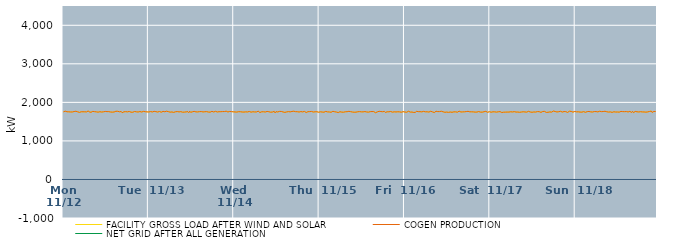
| Category | FACILITY GROSS LOAD AFTER WIND AND SOLAR | COGEN PRODUCTION | NET GRID AFTER ALL GENERATION |
|---|---|---|---|
|  Mon  11/12 | 1754 | 1754 |  |
|  Mon  11/12 | 1760 | 1760 |  |
|  Mon  11/12 | 1771 | 1771 |  |
|  Mon  11/12 | 1764 | 1764 |  |
|  Mon  11/12 | 1756 | 1756 |  |
|  Mon  11/12 | 1752 | 1752 |  |
|  Mon  11/12 | 1755 | 1755 |  |
|  Mon  11/12 | 1756 | 1756 |  |
|  Mon  11/12 | 1751 | 1751 |  |
|  Mon  11/12 | 1760 | 1760 |  |
|  Mon  11/12 | 1751 | 1751 |  |
|  Mon  11/12 | 1750 | 1750 |  |
|  Mon  11/12 | 1762 | 1762 |  |
|  Mon  11/12 | 1755 | 1755 |  |
|  Mon  11/12 | 1769 | 1769 |  |
|  Mon  11/12 | 1765 | 1765 |  |
|  Mon  11/12 | 1755 | 1755 |  |
|  Mon  11/12 | 1764 | 1764 |  |
|  Mon  11/12 | 1740 | 1740 |  |
|  Mon  11/12 | 1749 | 1749 |  |
|  Mon  11/12 | 1756 | 1756 |  |
|  Mon  11/12 | 1748 | 1748 |  |
|  Mon  11/12 | 1756 | 1756 |  |
|  Mon  11/12 | 1747 | 1747 |  |
|  Mon  11/12 | 1755 | 1755 |  |
|  Mon  11/12 | 1747 | 1747 |  |
|  Mon  11/12 | 1753 | 1753 |  |
|  Mon  11/12 | 1756 | 1756 |  |
|  Mon  11/12 | 1778 | 1778 |  |
|  Mon  11/12 | 1751 | 1751 |  |
|  Mon  11/12 | 1773 | 1773 |  |
|  Mon  11/12 | 1743 | 1743 |  |
|  Mon  11/12 | 1768 | 1768 |  |
|  Mon  11/12 | 1766 | 1766 |  |
|  Mon  11/12 | 1769 | 1769 |  |
|  Mon  11/12 | 1759 | 1759 |  |
|  Mon  11/12 | 1764 | 1764 |  |
|  Mon  11/12 | 1754 | 1754 |  |
|  Mon  11/12 | 1755 | 1755 |  |
|  Mon  11/12 | 1746 | 1746 |  |
|  Mon  11/12 | 1747 | 1747 |  |
|  Mon  11/12 | 1757 | 1757 |  |
|  Mon  11/12 | 1767 | 1767 |  |
|  Mon  11/12 | 1749 | 1749 |  |
|  Mon  11/12 | 1744 | 1744 |  |
|  Mon  11/12 | 1755 | 1755 |  |
|  Mon  11/12 | 1740 | 1740 |  |
|  Mon  11/12 | 1764 | 1764 |  |
|  Mon  11/12 | 1752 | 1752 |  |
|  Mon  11/12 | 1760 | 1760 |  |
|  Mon  11/12 | 1745 | 1745 |  |
|  Mon  11/12 | 1760 | 1760 |  |
|  Mon  11/12 | 1757 | 1757 |  |
|  Mon  11/12 | 1750 | 1750 |  |
|  Mon  11/12 | 1759 | 1759 |  |
|  Mon  11/12 | 1746 | 1746 |  |
|  Mon  11/12 | 1747 | 1747 |  |
|  Mon  11/12 | 1751 | 1751 |  |
|  Mon  11/12 | 1761 | 1761 |  |
|  Mon  11/12 | 1769 | 1769 |  |
|  Mon  11/12 | 1752 | 1752 |  |
|  Mon  11/12 | 1768 | 1768 |  |
|  Mon  11/12 | 1764 | 1764 |  |
|  Mon  11/12 | 1756 | 1756 |  |
|  Mon  11/12 | 1736 | 1736 |  |
|  Mon  11/12 | 1763 | 1763 |  |
|  Mon  11/12 | 1731 | 1731 |  |
|  Mon  11/12 | 1746 | 1746 |  |
|  Mon  11/12 | 1755 | 1755 |  |
|  Mon  11/12 | 1748 | 1748 |  |
|  Mon  11/12 | 1759 | 1759 |  |
|  Mon  11/12 | 1752 | 1752 |  |
|  Mon  11/12 | 1754 | 1754 |  |
|  Mon  11/12 | 1738 | 1738 |  |
|  Mon  11/12 | 1763 | 1763 |  |
|  Mon  11/12 | 1760 | 1760 |  |
|  Mon  11/12 | 1745 | 1745 |  |
|  Mon  11/12 | 1762 | 1762 |  |
|  Mon  11/12 | 1744 | 1744 |  |
|  Mon  11/12 | 1759 | 1759 |  |
|  Mon  11/12 | 1763 | 1763 |  |
|  Mon  11/12 | 1746 | 1746 |  |
|  Mon  11/12 | 1755 | 1755 |  |
|  Mon  11/12 | 1753 | 1753 |  |
|  Mon  11/12 | 1750 | 1750 |  |
|  Mon  11/12 | 1755 | 1755 |  |
|  Mon  11/12 | 1762 | 1762 |  |
|  Mon  11/12 | 1760 | 1760 |  |
|  Mon  11/12 | 1750 | 1750 |  |
|  Mon  11/12 | 1751 | 1751 |  |
|  Mon  11/12 | 1766 | 1766 |  |
|  Mon  11/12 | 1750 | 1750 |  |
|  Mon  11/12 | 1758 | 1758 |  |
|  Mon  11/12 | 1742 | 1742 |  |
|  Mon  11/12 | 1753 | 1753 |  |
|  Mon  11/12 | 1757 | 1757 |  |
|  Tue  11/13 | 1751 | 1751 |  |
|  Tue  11/13 | 1740 | 1740 |  |
|  Tue  11/13 | 1761 | 1761 |  |
|  Tue  11/13 | 1739 | 1739 |  |
|  Tue  11/13 | 1752 | 1752 |  |
|  Tue  11/13 | 1754 | 1754 |  |
|  Tue  11/13 | 1767 | 1767 |  |
|  Tue  11/13 | 1749 | 1749 |  |
|  Tue  11/13 | 1759 | 1759 |  |
|  Tue  11/13 | 1754 | 1754 |  |
|  Tue  11/13 | 1749 | 1749 |  |
|  Tue  11/13 | 1762 | 1762 |  |
|  Tue  11/13 | 1763 | 1763 |  |
|  Tue  11/13 | 1761 | 1761 |  |
|  Tue  11/13 | 1745 | 1745 |  |
|  Tue  11/13 | 1759 | 1759 |  |
|  Tue  11/13 | 1766 | 1766 |  |
|  Tue  11/13 | 1754 | 1754 |  |
|  Tue  11/13 | 1757 | 1757 |  |
|  Tue  11/13 | 1750 | 1750 |  |
|  Tue  11/13 | 1770 | 1770 |  |
|  Tue  11/13 | 1758 | 1758 |  |
|  Tue  11/13 | 1759 | 1759 |  |
|  Tue  11/13 | 1758 | 1758 |  |
|  Tue  11/13 | 1746 | 1746 |  |
|  Tue  11/13 | 1734 | 1734 |  |
|  Tue  11/13 | 1751 | 1751 |  |
|  Tue  11/13 | 1766 | 1766 |  |
|  Tue  11/13 | 1740 | 1740 |  |
|  Tue  11/13 | 1753 | 1753 |  |
|  Tue  11/13 | 1756 | 1756 |  |
|  Tue  11/13 | 1756 | 1756 |  |
|  Tue  11/13 | 1761 | 1761 |  |
|  Tue  11/13 | 1758 | 1758 |  |
|  Tue  11/13 | 1753 | 1753 |  |
|  Tue  11/13 | 1743 | 1743 |  |
|  Tue  11/13 | 1759 | 1759 |  |
|  Tue  11/13 | 1755 | 1755 |  |
|  Tue  11/13 | 1745 | 1745 |  |
|  Tue  11/13 | 1764 | 1764 |  |
|  Tue  11/13 | 1747 | 1747 |  |
|  Tue  11/13 | 1751 | 1751 |  |
|  Tue  11/13 | 1753 | 1753 |  |
|  Tue  11/13 | 1750 | 1750 |  |
|  Tue  11/13 | 1759 | 1759 |  |
|  Tue  11/13 | 1732 | 1732 |  |
|  Tue  11/13 | 1772 | 1772 |  |
|  Tue  11/13 | 1742 | 1742 |  |
|  Tue  11/13 | 1759 | 1759 |  |
|  Tue  11/13 | 1755 | 1755 |  |
|  Tue  11/13 | 1761 | 1761 |  |
|  Tue  11/13 | 1766 | 1766 |  |
|  Tue  11/13 | 1755 | 1755 |  |
|  Tue  11/13 | 1754 | 1754 |  |
|  Tue  11/13 | 1746 | 1746 |  |
|  Tue  11/13 | 1752 | 1752 |  |
|  Tue  11/13 | 1748 | 1748 |  |
|  Tue  11/13 | 1759 | 1759 |  |
|  Tue  11/13 | 1754 | 1754 |  |
|  Tue  11/13 | 1761 | 1761 |  |
|  Tue  11/13 | 1759 | 1759 |  |
|  Tue  11/13 | 1752 | 1752 |  |
|  Tue  11/13 | 1758 | 1758 |  |
|  Tue  11/13 | 1757 | 1757 |  |
|  Tue  11/13 | 1757 | 1757 |  |
|  Tue  11/13 | 1760 | 1760 |  |
|  Tue  11/13 | 1763 | 1763 |  |
|  Tue  11/13 | 1749 | 1749 |  |
|  Tue  11/13 | 1760 | 1760 |  |
|  Tue  11/13 | 1746 | 1746 |  |
|  Tue  11/13 | 1754 | 1754 |  |
|  Tue  11/13 | 1767 | 1767 |  |
|  Tue  11/13 | 1763 | 1763 |  |
|  Tue  11/13 | 1751 | 1751 |  |
|  Tue  11/13 | 1760 | 1760 |  |
|  Tue  11/13 | 1767 | 1767 |  |
|  Tue  11/13 | 1769 | 1769 |  |
|  Tue  11/13 | 1751 | 1751 |  |
|  Tue  11/13 | 1748 | 1748 |  |
|  Tue  11/13 | 1758 | 1758 |  |
|  Tue  11/13 | 1747 | 1747 |  |
|  Tue  11/13 | 1758 | 1758 |  |
|  Tue  11/13 | 1747 | 1747 |  |
|  Tue  11/13 | 1761 | 1761 |  |
|  Tue  11/13 | 1762 | 1762 |  |
|  Tue  11/13 | 1762 | 1762 |  |
|  Tue  11/13 | 1761 | 1761 |  |
|  Tue  11/13 | 1770 | 1770 |  |
|  Tue  11/13 | 1756 | 1756 |  |
|  Tue  11/13 | 1751 | 1751 |  |
|  Tue  11/13 | 1746 | 1746 |  |
|  Tue  11/13 | 1764 | 1764 |  |
|  Tue  11/13 | 1756 | 1756 |  |
|  Tue  11/13 | 1760 | 1760 |  |
|  Tue  11/13 | 1755 | 1755 |  |
|  Tue  11/13 | 1755 | 1755 |  |
|  Wed  11/14 | 1753 | 1753 |  |
|  Wed  11/14 | 1751 | 1751 |  |
|  Wed  11/14 | 1755 | 1755 |  |
|  Wed  11/14 | 1748 | 1748 |  |
|  Wed  11/14 | 1761 | 1761 |  |
|  Wed  11/14 | 1758 | 1758 |  |
|  Wed  11/14 | 1745 | 1745 |  |
|  Wed  11/14 | 1757 | 1757 |  |
|  Wed  11/14 | 1759 | 1759 |  |
|  Wed  11/14 | 1750 | 1750 |  |
|  Wed  11/14 | 1759 | 1759 |  |
|  Wed  11/14 | 1748 | 1748 |  |
|  Wed  11/14 | 1731 | 1731 |  |
|  Wed  11/14 | 1754 | 1754 |  |
|  Wed  11/14 | 1761 | 1761 |  |
|  Wed  11/14 | 1751 | 1751 |  |
|  Wed  11/14 | 1754 | 1754 |  |
|  Wed  11/14 | 1763 | 1763 |  |
|  Wed  11/14 | 1749 | 1749 |  |
|  Wed  11/14 | 1746 | 1746 |  |
|  Wed  11/14 | 1747 | 1747 |  |
|  Wed  11/14 | 1756 | 1756 |  |
|  Wed  11/14 | 1744 | 1744 |  |
|  Wed  11/14 | 1752 | 1752 |  |
|  Wed  11/14 | 1763 | 1763 |  |
|  Wed  11/14 | 1751 | 1751 |  |
|  Wed  11/14 | 1740 | 1740 |  |
|  Wed  11/14 | 1771 | 1771 |  |
|  Wed  11/14 | 1766 | 1766 |  |
|  Wed  11/14 | 1737 | 1737 |  |
|  Wed  11/14 | 1741 | 1741 |  |
|  Wed  11/14 | 1756 | 1756 |  |
|  Wed  11/14 | 1759 | 1759 |  |
|  Wed  11/14 | 1756 | 1756 |  |
|  Wed  11/14 | 1740 | 1740 |  |
|  Wed  11/14 | 1750 | 1750 |  |
|  Wed  11/14 | 1731 | 1731 |  |
|  Wed  11/14 | 1764 | 1764 |  |
|  Wed  11/14 | 1763 | 1763 |  |
|  Wed  11/14 | 1757 | 1757 |  |
|  Wed  11/14 | 1768 | 1768 |  |
|  Wed  11/14 | 1745 | 1745 |  |
|  Wed  11/14 | 1751 | 1751 |  |
|  Wed  11/14 | 1749 | 1749 |  |
|  Wed  11/14 | 1762 | 1762 |  |
|  Wed  11/14 | 1767 | 1767 |  |
|  Wed  11/14 | 1727 | 1727 |  |
|  Wed  11/14 | 1759 | 1759 |  |
|  Wed  11/14 | 1763 | 1763 |  |
|  Wed  11/14 | 1751 | 1751 |  |
|  Wed  11/14 | 1755 | 1755 |  |
|  Wed  11/14 | 1765 | 1765 |  |
|  Wed  11/14 | 1756 | 1756 |  |
|  Wed  11/14 | 1764 | 1764 |  |
|  Wed  11/14 | 1751 | 1751 |  |
|  Wed  11/14 | 1751 | 1751 |  |
|  Wed  11/14 | 1752 | 1752 |  |
|  Wed  11/14 | 1740 | 1740 |  |
|  Wed  11/14 | 1751 | 1751 |  |
|  Wed  11/14 | 1752 | 1752 |  |
|  Wed  11/14 | 1746 | 1746 |  |
|  Wed  11/14 | 1760 | 1760 |  |
|  Wed  11/14 | 1755 | 1755 |  |
|  Wed  11/14 | 1754 | 1754 |  |
|  Wed  11/14 | 1767 | 1767 |  |
|  Wed  11/14 | 1764 | 1764 |  |
|  Wed  11/14 | 1764 | 1764 |  |
|  Wed  11/14 | 1770 | 1770 |  |
|  Wed  11/14 | 1756 | 1756 |  |
|  Wed  11/14 | 1759 | 1759 |  |
|  Wed  11/14 | 1747 | 1747 |  |
|  Wed  11/14 | 1758 | 1758 |  |
|  Wed  11/14 | 1750 | 1750 |  |
|  Wed  11/14 | 1750 | 1750 |  |
|  Wed  11/14 | 1744 | 1744 |  |
|  Wed  11/14 | 1761 | 1761 |  |
|  Wed  11/14 | 1741 | 1741 |  |
|  Wed  11/14 | 1753 | 1753 |  |
|  Wed  11/14 | 1764 | 1764 |  |
|  Wed  11/14 | 1765 | 1765 |  |
|  Wed  11/14 | 1761 | 1761 |  |
|  Wed  11/14 | 1737 | 1737 |  |
|  Wed  11/14 | 1762 | 1762 |  |
|  Wed  11/14 | 1758 | 1758 |  |
|  Wed  11/14 | 1756 | 1756 |  |
|  Wed  11/14 | 1760 | 1760 |  |
|  Wed  11/14 | 1747 | 1747 |  |
|  Wed  11/14 | 1764 | 1764 |  |
|  Wed  11/14 | 1754 | 1754 |  |
|  Wed  11/14 | 1750 | 1750 |  |
|  Wed  11/14 | 1758 | 1758 |  |
|  Wed  11/14 | 1756 | 1756 |  |
|  Wed  11/14 | 1758 | 1758 |  |
|  Wed  11/14 | 1757 | 1757 |  |
|  Wed  11/14 | 1755 | 1755 |  |
|  Wed  11/14 | 1744 | 1744 |  |
|  Thu  11/15 | 1735 | 1735 |  |
|  Thu  11/15 | 1755 | 1755 |  |
|  Thu  11/15 | 1757 | 1757 |  |
|  Thu  11/15 | 1749 | 1749 |  |
|  Thu  11/15 | 1770 | 1770 |  |
|  Thu  11/15 | 1745 | 1745 |  |
|  Thu  11/15 | 1758 | 1758 |  |
|  Thu  11/15 | 1765 | 1765 |  |
|  Thu  11/15 | 1755 | 1755 |  |
|  Thu  11/15 | 1753 | 1753 |  |
|  Thu  11/15 | 1763 | 1763 |  |
|  Thu  11/15 | 1751 | 1751 |  |
|  Thu  11/15 | 1751 | 1751 |  |
|  Thu  11/15 | 1743 | 1743 |  |
|  Thu  11/15 | 1751 | 1751 |  |
|  Thu  11/15 | 1768 | 1768 |  |
|  Thu  11/15 | 1759 | 1759 |  |
|  Thu  11/15 | 1757 | 1757 |  |
|  Thu  11/15 | 1735 | 1735 |  |
|  Thu  11/15 | 1749 | 1749 |  |
|  Thu  11/15 | 1764 | 1764 |  |
|  Thu  11/15 | 1736 | 1736 |  |
|  Thu  11/15 | 1759 | 1759 |  |
|  Thu  11/15 | 1757 | 1757 |  |
|  Thu  11/15 | 1758 | 1758 |  |
|  Thu  11/15 | 1747 | 1747 |  |
|  Thu  11/15 | 1761 | 1761 |  |
|  Thu  11/15 | 1745 | 1745 |  |
|  Thu  11/15 | 1766 | 1766 |  |
|  Thu  11/15 | 1756 | 1756 |  |
|  Thu  11/15 | 1746 | 1746 |  |
|  Thu  11/15 | 1758 | 1758 |  |
|  Thu  11/15 | 1759 | 1759 |  |
|  Thu  11/15 | 1767 | 1767 |  |
|  Thu  11/15 | 1758 | 1758 |  |
|  Thu  11/15 | 1759 | 1759 |  |
|  Thu  11/15 | 1739 | 1739 |  |
|  Thu  11/15 | 1749 | 1749 |  |
|  Thu  11/15 | 1760 | 1760 |  |
|  Thu  11/15 | 1744 | 1744 |  |
|  Thu  11/15 | 1758 | 1758 |  |
|  Thu  11/15 | 1746 | 1746 |  |
|  Thu  11/15 | 1757 | 1757 |  |
|  Thu  11/15 | 1756 | 1756 |  |
|  Thu  11/15 | 1759 | 1759 |  |
|  Thu  11/15 | 1760 | 1760 |  |
|  Thu  11/15 | 1754 | 1754 |  |
|  Thu  11/15 | 1754 | 1754 |  |
|  Thu  11/15 | 1758 | 1758 |  |
|  Thu  11/15 | 1754 | 1754 |  |
|  Thu  11/15 | 1740 | 1740 |  |
|  Thu  11/15 | 1761 | 1761 |  |
|  Thu  11/15 | 1758 | 1758 |  |
|  Thu  11/15 | 1751 | 1751 |  |
|  Thu  11/15 | 1760 | 1760 |  |
|  Thu  11/15 | 1746 | 1746 |  |
|  Thu  11/15 | 1749 | 1749 |  |
|  Thu  11/15 | 1759 | 1759 |  |
|  Thu  11/15 | 1754 | 1754 |  |
|  Thu  11/15 | 1762 | 1762 |  |
|  Thu  11/15 | 1762 | 1762 |  |
|  Thu  11/15 | 1760 | 1760 |  |
|  Thu  11/15 | 1763 | 1763 |  |
|  Thu  11/15 | 1731 | 1731 |  |
|  Thu  11/15 | 1744 | 1744 |  |
|  Thu  11/15 | 1753 | 1753 |  |
|  Thu  11/15 | 1750 | 1750 |  |
|  Thu  11/15 | 1768 | 1768 |  |
|  Thu  11/15 | 1750 | 1750 |  |
|  Thu  11/15 | 1762 | 1762 |  |
|  Thu  11/15 | 1754 | 1754 |  |
|  Thu  11/15 | 1757 | 1757 |  |
|  Thu  11/15 | 1750 | 1750 |  |
|  Thu  11/15 | 1765 | 1765 |  |
|  Thu  11/15 | 1739 | 1739 |  |
|  Thu  11/15 | 1733 | 1733 |  |
|  Thu  11/15 | 1755 | 1755 |  |
|  Thu  11/15 | 1752 | 1752 |  |
|  Thu  11/15 | 1755 | 1755 |  |
|  Thu  11/15 | 1763 | 1763 |  |
|  Thu  11/15 | 1763 | 1763 |  |
|  Thu  11/15 | 1743 | 1743 |  |
|  Thu  11/15 | 1746 | 1746 |  |
|  Thu  11/15 | 1748 | 1748 |  |
|  Thu  11/15 | 1755 | 1755 |  |
|  Thu  11/15 | 1769 | 1769 |  |
|  Thu  11/15 | 1751 | 1751 |  |
|  Thu  11/15 | 1742 | 1742 |  |
|  Thu  11/15 | 1756 | 1756 |  |
|  Thu  11/15 | 1753 | 1753 |  |
|  Thu  11/15 | 1754 | 1754 |  |
|  Thu  11/15 | 1762 | 1762 |  |
|  Thu  11/15 | 1744 | 1744 |  |
|  Thu  11/15 | 1768 | 1768 |  |
|  Thu  11/15 | 1759 | 1759 |  |
|  Thu  11/15 | 1744 | 1744 |  |
|  Fri  11/16 | 1749 | 1749 |  |
|  Fri  11/16 | 1750 | 1750 |  |
|  Fri  11/16 | 1744 | 1744 |  |
|  Fri  11/16 | 1752 | 1752 |  |
|  Fri  11/16 | 1769 | 1769 |  |
|  Fri  11/16 | 1752 | 1752 |  |
|  Fri  11/16 | 1748 | 1748 |  |
|  Fri  11/16 | 1767 | 1767 |  |
|  Fri  11/16 | 1748 | 1748 |  |
|  Fri  11/16 | 1762 | 1762 |  |
|  Fri  11/16 | 1738 | 1738 |  |
|  Fri  11/16 | 1759 | 1759 |  |
|  Fri  11/16 | 1742 | 1742 |  |
|  Fri  11/16 | 1769 | 1769 |  |
|  Fri  11/16 | 1746 | 1746 |  |
|  Fri  11/16 | 1759 | 1759 |  |
|  Fri  11/16 | 1755 | 1755 |  |
|  Fri  11/16 | 1759 | 1759 |  |
|  Fri  11/16 | 1764 | 1764 |  |
|  Fri  11/16 | 1754 | 1754 |  |
|  Fri  11/16 | 1752 | 1752 |  |
|  Fri  11/16 | 1766 | 1766 |  |
|  Fri  11/16 | 1761 | 1761 |  |
|  Fri  11/16 | 1755 | 1755 |  |
|  Fri  11/16 | 1752 | 1752 |  |
|  Fri  11/16 | 1756 | 1756 |  |
|  Fri  11/16 | 1745 | 1745 |  |
|  Fri  11/16 | 1748 | 1748 |  |
|  Fri  11/16 | 1754 | 1754 |  |
|  Fri  11/16 | 1769 | 1769 |  |
|  Fri  11/16 | 1757 | 1757 |  |
|  Fri  11/16 | 1753 | 1753 |  |
|  Fri  11/16 | 1749 | 1749 |  |
|  Fri  11/16 | 1736 | 1736 |  |
|  Fri  11/16 | 1758 | 1758 |  |
|  Fri  11/16 | 1769 | 1769 |  |
|  Fri  11/16 | 1755 | 1755 |  |
|  Fri  11/16 | 1760 | 1760 |  |
|  Fri  11/16 | 1753 | 1753 |  |
|  Fri  11/16 | 1761 | 1761 |  |
|  Fri  11/16 | 1774 | 1774 |  |
|  Fri  11/16 | 1769 | 1769 |  |
|  Fri  11/16 | 1759 | 1759 |  |
|  Fri  11/16 | 1755 | 1755 |  |
|  Fri  11/16 | 1751 | 1751 |  |
|  Fri  11/16 | 1742 | 1742 |  |
|  Fri  11/16 | 1754 | 1754 |  |
|  Fri  11/16 | 1748 | 1748 |  |
|  Fri  11/16 | 1760 | 1760 |  |
|  Fri  11/16 | 1741 | 1741 |  |
|  Fri  11/16 | 1747 | 1747 |  |
|  Fri  11/16 | 1750 | 1750 |  |
|  Fri  11/16 | 1728 | 1728 |  |
|  Fri  11/16 | 1742 | 1742 |  |
|  Fri  11/16 | 1740 | 1740 |  |
|  Fri  11/16 | 1754 | 1754 |  |
|  Fri  11/16 | 1738 | 1738 |  |
|  Fri  11/16 | 1754 | 1754 |  |
|  Fri  11/16 | 1754 | 1754 |  |
|  Fri  11/16 | 1745 | 1745 |  |
|  Fri  11/16 | 1762 | 1762 |  |
|  Fri  11/16 | 1771 | 1771 |  |
|  Fri  11/16 | 1752 | 1752 |  |
|  Fri  11/16 | 1750 | 1750 |  |
|  Fri  11/16 | 1760 | 1760 |  |
|  Fri  11/16 | 1753 | 1753 |  |
|  Fri  11/16 | 1759 | 1759 |  |
|  Fri  11/16 | 1755 | 1755 |  |
|  Fri  11/16 | 1758 | 1758 |  |
|  Fri  11/16 | 1761 | 1761 |  |
|  Fri  11/16 | 1758 | 1758 |  |
|  Fri  11/16 | 1767 | 1767 |  |
|  Fri  11/16 | 1750 | 1750 |  |
|  Fri  11/16 | 1755 | 1755 |  |
|  Fri  11/16 | 1753 | 1753 |  |
|  Fri  11/16 | 1755 | 1755 |  |
|  Fri  11/16 | 1764 | 1764 |  |
|  Fri  11/16 | 1753 | 1753 |  |
|  Fri  11/16 | 1756 | 1756 |  |
|  Fri  11/16 | 1747 | 1747 |  |
|  Fri  11/16 | 1760 | 1760 |  |
|  Fri  11/16 | 1748 | 1748 |  |
|  Fri  11/16 | 1747 | 1747 |  |
|  Fri  11/16 | 1761 | 1761 |  |
|  Fri  11/16 | 1745 | 1745 |  |
|  Fri  11/16 | 1747 | 1747 |  |
|  Fri  11/16 | 1757 | 1757 |  |
|  Fri  11/16 | 1746 | 1746 |  |
|  Fri  11/16 | 1751 | 1751 |  |
|  Fri  11/16 | 1757 | 1757 |  |
|  Fri  11/16 | 1753 | 1753 |  |
|  Fri  11/16 | 1766 | 1766 |  |
|  Fri  11/16 | 1742 | 1742 |  |
|  Fri  11/16 | 1742 | 1742 |  |
|  Fri  11/16 | 1745 | 1745 |  |
|  Fri  11/16 | 1758 | 1758 |  |
|  Sat  11/17 | 1767 | 1767 |  |
|  Sat  11/17 | 1744 | 1744 |  |
|  Sat  11/17 | 1749 | 1749 |  |
|  Sat  11/17 | 1755 | 1755 |  |
|  Sat  11/17 | 1757 | 1757 |  |
|  Sat  11/17 | 1754 | 1754 |  |
|  Sat  11/17 | 1774 | 1774 |  |
|  Sat  11/17 | 1747 | 1747 |  |
|  Sat  11/17 | 1762 | 1762 |  |
|  Sat  11/17 | 1755 | 1755 |  |
|  Sat  11/17 | 1756 | 1756 |  |
|  Sat  11/17 | 1760 | 1760 |  |
|  Sat  11/17 | 1754 | 1754 |  |
|  Sat  11/17 | 1737 | 1737 |  |
|  Sat  11/17 | 1756 | 1756 |  |
|  Sat  11/17 | 1745 | 1745 |  |
|  Sat  11/17 | 1765 | 1765 |  |
|  Sat  11/17 | 1746 | 1746 |  |
|  Sat  11/17 | 1757 | 1757 |  |
|  Sat  11/17 | 1748 | 1748 |  |
|  Sat  11/17 | 1742 | 1742 |  |
|  Sat  11/17 | 1748 | 1748 |  |
|  Sat  11/17 | 1735 | 1735 |  |
|  Sat  11/17 | 1756 | 1756 |  |
|  Sat  11/17 | 1749 | 1749 |  |
|  Sat  11/17 | 1751 | 1751 |  |
|  Sat  11/17 | 1737 | 1737 |  |
|  Sat  11/17 | 1759 | 1759 |  |
|  Sat  11/17 | 1760 | 1760 |  |
|  Sat  11/17 | 1748 | 1748 |  |
|  Sat  11/17 | 1752 | 1752 |  |
|  Sat  11/17 | 1749 | 1749 |  |
|  Sat  11/17 | 1754 | 1754 |  |
|  Sat  11/17 | 1743 | 1743 |  |
|  Sat  11/17 | 1763 | 1763 |  |
|  Sat  11/17 | 1749 | 1749 |  |
|  Sat  11/17 | 1755 | 1755 |  |
|  Sat  11/17 | 1756 | 1756 |  |
|  Sat  11/17 | 1745 | 1745 |  |
|  Sat  11/17 | 1751 | 1751 |  |
|  Sat  11/17 | 1754 | 1754 |  |
|  Sat  11/17 | 1747 | 1747 |  |
|  Sat  11/17 | 1762 | 1762 |  |
|  Sat  11/17 | 1767 | 1767 |  |
|  Sat  11/17 | 1764 | 1764 |  |
|  Sat  11/17 | 1750 | 1750 |  |
|  Sat  11/17 | 1758 | 1758 |  |
|  Sat  11/17 | 1743 | 1743 |  |
|  Sat  11/17 | 1747 | 1747 |  |
|  Sat  11/17 | 1751 | 1751 |  |
|  Sat  11/17 | 1766 | 1766 |  |
|  Sat  11/17 | 1748 | 1748 |  |
|  Sat  11/17 | 1753 | 1753 |  |
|  Sat  11/17 | 1760 | 1760 |  |
|  Sat  11/17 | 1752 | 1752 |  |
|  Sat  11/17 | 1759 | 1759 |  |
|  Sat  11/17 | 1755 | 1755 |  |
|  Sat  11/17 | 1740 | 1740 |  |
|  Sat  11/17 | 1761 | 1761 |  |
|  Sat  11/17 | 1763 | 1763 |  |
|  Sat  11/17 | 1764 | 1764 |  |
|  Sat  11/17 | 1766 | 1766 |  |
|  Sat  11/17 | 1752 | 1752 |  |
|  Sat  11/17 | 1740 | 1740 |  |
|  Sat  11/17 | 1745 | 1745 |  |
|  Sat  11/17 | 1743 | 1743 |  |
|  Sat  11/17 | 1758 | 1758 |  |
|  Sat  11/17 | 1752 | 1752 |  |
|  Sat  11/17 | 1759 | 1759 |  |
|  Sat  11/17 | 1747 | 1747 |  |
|  Sat  11/17 | 1739 | 1739 |  |
|  Sat  11/17 | 1775 | 1775 |  |
|  Sat  11/17 | 1761 | 1761 |  |
|  Sat  11/17 | 1763 | 1763 |  |
|  Sat  11/17 | 1748 | 1748 |  |
|  Sat  11/17 | 1751 | 1751 |  |
|  Sat  11/17 | 1758 | 1758 |  |
|  Sat  11/17 | 1757 | 1757 |  |
|  Sat  11/17 | 1745 | 1745 |  |
|  Sat  11/17 | 1768 | 1768 |  |
|  Sat  11/17 | 1756 | 1756 |  |
|  Sat  11/17 | 1749 | 1749 |  |
|  Sat  11/17 | 1760 | 1760 |  |
|  Sat  11/17 | 1762 | 1762 |  |
|  Sat  11/17 | 1758 | 1758 |  |
|  Sat  11/17 | 1759 | 1759 |  |
|  Sat  11/17 | 1737 | 1737 |  |
|  Sat  11/17 | 1739 | 1739 |  |
|  Sat  11/17 | 1756 | 1756 |  |
|  Sat  11/17 | 1770 | 1770 |  |
|  Sat  11/17 | 1748 | 1748 |  |
|  Sat  11/17 | 1765 | 1765 |  |
|  Sat  11/17 | 1757 | 1757 |  |
|  Sat  11/17 | 1747 | 1747 |  |
|  Sat  11/17 | 1757 | 1757 |  |
|  Sat  11/17 | 1764 | 1764 |  |
|  Sun  11/18 | 1753 | 1753 |  |
|  Sun  11/18 | 1754 | 1754 |  |
|  Sun  11/18 | 1764 | 1764 |  |
|  Sun  11/18 | 1755 | 1755 |  |
|  Sun  11/18 | 1748 | 1748 |  |
|  Sun  11/18 | 1748 | 1748 |  |
|  Sun  11/18 | 1753 | 1753 |  |
|  Sun  11/18 | 1746 | 1746 |  |
|  Sun  11/18 | 1746 | 1746 |  |
|  Sun  11/18 | 1759 | 1759 |  |
|  Sun  11/18 | 1748 | 1748 |  |
|  Sun  11/18 | 1742 | 1742 |  |
|  Sun  11/18 | 1757 | 1757 |  |
|  Sun  11/18 | 1759 | 1759 |  |
|  Sun  11/18 | 1762 | 1762 |  |
|  Sun  11/18 | 1764 | 1764 |  |
|  Sun  11/18 | 1761 | 1761 |  |
|  Sun  11/18 | 1753 | 1753 |  |
|  Sun  11/18 | 1737 | 1737 |  |
|  Sun  11/18 | 1750 | 1750 |  |
|  Sun  11/18 | 1756 | 1756 |  |
|  Sun  11/18 | 1761 | 1761 |  |
|  Sun  11/18 | 1760 | 1760 |  |
|  Sun  11/18 | 1761 | 1761 |  |
|  Sun  11/18 | 1760 | 1760 |  |
|  Sun  11/18 | 1753 | 1753 |  |
|  Sun  11/18 | 1763 | 1763 |  |
|  Sun  11/18 | 1769 | 1769 |  |
|  Sun  11/18 | 1758 | 1758 |  |
|  Sun  11/18 | 1760 | 1760 |  |
|  Sun  11/18 | 1757 | 1757 |  |
|  Sun  11/18 | 1762 | 1762 |  |
|  Sun  11/18 | 1756 | 1756 |  |
|  Sun  11/18 | 1769 | 1769 |  |
|  Sun  11/18 | 1749 | 1749 |  |
|  Sun  11/18 | 1757 | 1757 |  |
|  Sun  11/18 | 1741 | 1741 |  |
|  Sun  11/18 | 1748 | 1748 |  |
|  Sun  11/18 | 1749 | 1749 |  |
|  Sun  11/18 | 1753 | 1753 |  |
|  Sun  11/18 | 1774 | 1774 |  |
|  Sun  11/18 | 1740 | 1740 |  |
|  Sun  11/18 | 1763 | 1763 |  |
|  Sun  11/18 | 1756 | 1756 |  |
|  Sun  11/18 | 1740 | 1740 |  |
|  Sun  11/18 | 1749 | 1749 |  |
|  Sun  11/18 | 1762 | 1762 |  |
|  Sun  11/18 | 1750 | 1750 |  |
|  Sun  11/18 | 1756 | 1756 |  |
|  Sun  11/18 | 1746 | 1746 |  |
|  Sun  11/18 | 1760 | 1760 |  |
|  Sun  11/18 | 1765 | 1765 |  |
|  Sun  11/18 | 1760 | 1760 |  |
|  Sun  11/18 | 1760 | 1760 |  |
|  Sun  11/18 | 1752 | 1752 |  |
|  Sun  11/18 | 1759 | 1759 |  |
|  Sun  11/18 | 1773 | 1773 |  |
|  Sun  11/18 | 1762 | 1762 |  |
|  Sun  11/18 | 1762 | 1762 |  |
|  Sun  11/18 | 1752 | 1752 |  |
|  Sun  11/18 | 1743 | 1743 |  |
|  Sun  11/18 | 1765 | 1765 |  |
|  Sun  11/18 | 1761 | 1761 |  |
|  Sun  11/18 | 1738 | 1738 |  |
|  Sun  11/18 | 1770 | 1770 |  |
|  Sun  11/18 | 1733 | 1733 |  |
|  Sun  11/18 | 1756 | 1756 |  |
|  Sun  11/18 | 1764 | 1764 |  |
|  Sun  11/18 | 1761 | 1761 |  |
|  Sun  11/18 | 1756 | 1756 |  |
|  Sun  11/18 | 1749 | 1749 |  |
|  Sun  11/18 | 1751 | 1751 |  |
|  Sun  11/18 | 1758 | 1758 |  |
|  Sun  11/18 | 1758 | 1758 |  |
|  Sun  11/18 | 1767 | 1767 |  |
|  Sun  11/18 | 1752 | 1752 |  |
|  Sun  11/18 | 1757 | 1757 |  |
|  Sun  11/18 | 1751 | 1751 |  |
|  Sun  11/18 | 1741 | 1741 |  |
|  Sun  11/18 | 1746 | 1746 |  |
|  Sun  11/18 | 1754 | 1754 |  |
|  Sun  11/18 | 1752 | 1752 |  |
|  Sun  11/18 | 1738 | 1738 |  |
|  Sun  11/18 | 1763 | 1763 |  |
|  Sun  11/18 | 1739 | 1739 |  |
|  Sun  11/18 | 1773 | 1773 |  |
|  Sun  11/18 | 1739 | 1739 |  |
|  Sun  11/18 | 1757 | 1757 |  |
|  Sun  11/18 | 1765 | 1765 |  |
|  Sun  11/18 | 1758 | 1758 |  |
|  Sun  11/18 | 1761 | 1761 |  |
|  Sun  11/18 | 1772 | 1772 |  |